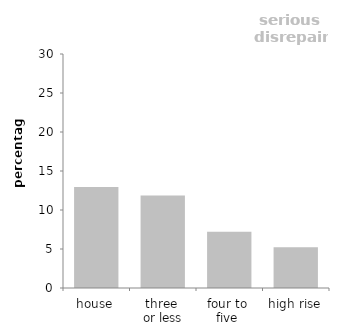
| Category | serious
 disrepair |
|---|---|
| house | 12.934 |
| three 
or less | 11.867 |
| four to 
five  | 7.207 |
| high rise | 5.223 |